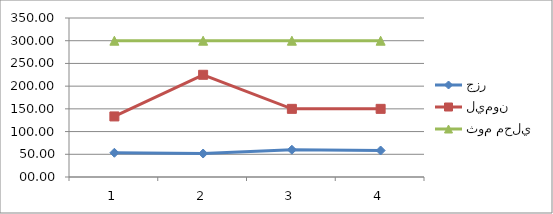
| Category | جزر | ليمون | ثوم محلي |
|---|---|---|---|
| 0 | 53.33 | 133.33 | 300 |
| 1 | 51.67 | 225 | 300 |
| 2 | 60 | 150 | 300 |
| 3 | 58.33 | 150 | 300 |